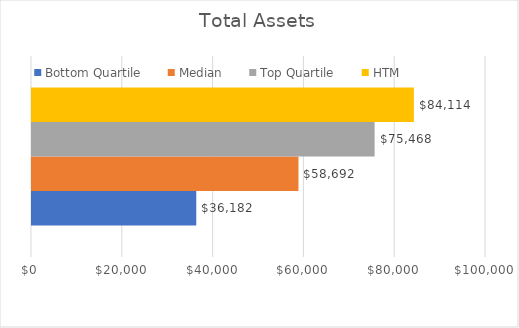
| Category | Bottom Quartile | Median | Top Quartile | HTM  |
|---|---|---|---|---|
| 0 | 36182 | 58692 | 75468 | 84114 |